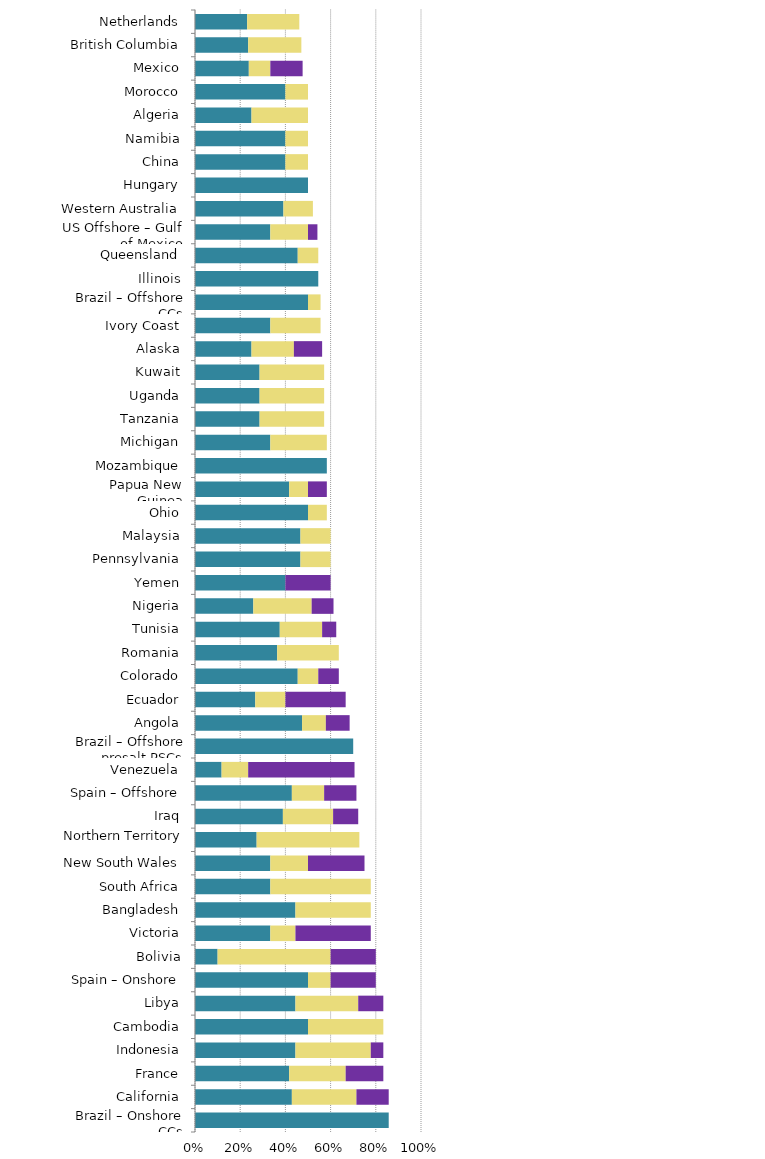
| Category | Mild deterrent to investment | Strong deterrent to investment | Would not pursue investment due to this factor |
|---|---|---|---|
| Brazil – Onshore CCs | 0.857 | 0 | 0 |
| California | 0.429 | 0.286 | 0.143 |
| France | 0.417 | 0.25 | 0.167 |
| Indonesia | 0.444 | 0.333 | 0.056 |
| Cambodia | 0.5 | 0.333 | 0 |
| Libya | 0.444 | 0.278 | 0.111 |
| Spain – Onshore | 0.5 | 0.1 | 0.2 |
| Bolivia | 0.1 | 0.5 | 0.2 |
| Victoria | 0.333 | 0.111 | 0.333 |
| Bangladesh | 0.444 | 0.333 | 0 |
| South Africa | 0.333 | 0.444 | 0 |
| New South Wales | 0.333 | 0.167 | 0.25 |
| Northern Territory | 0.273 | 0.455 | 0 |
| Iraq | 0.389 | 0.222 | 0.111 |
| Spain – Offshore | 0.429 | 0.143 | 0.143 |
| Venezuela | 0.118 | 0.118 | 0.471 |
| Brazil – Offshore presalt PSCs | 0.7 | 0 | 0 |
| Angola | 0.474 | 0.105 | 0.105 |
| Ecuador | 0.267 | 0.133 | 0.267 |
| Colorado | 0.455 | 0.091 | 0.091 |
| Romania | 0.364 | 0.273 | 0 |
| Tunisia | 0.375 | 0.188 | 0.062 |
| Nigeria | 0.258 | 0.258 | 0.097 |
| Yemen | 0.4 | 0 | 0.2 |
| Pennsylvania | 0.467 | 0.133 | 0 |
| Malaysia | 0.467 | 0.133 | 0 |
| Ohio | 0.5 | 0.083 | 0 |
| Papua New Guinea | 0.417 | 0.083 | 0.083 |
| Mozambique | 0.583 | 0 | 0 |
| Michigan | 0.333 | 0.25 | 0 |
| Tanzania | 0.286 | 0.286 | 0 |
| Uganda | 0.286 | 0.286 | 0 |
| Kuwait | 0.286 | 0.286 | 0 |
| Alaska | 0.25 | 0.188 | 0.125 |
| Ivory Coast | 0.333 | 0.222 | 0 |
| Brazil – Offshore CCs | 0.5 | 0.056 | 0 |
| Illinois | 0.545 | 0 | 0 |
| Queensland | 0.455 | 0.091 | 0 |
| US Offshore – Gulf of Mexico | 0.333 | 0.167 | 0.042 |
| Western Australia | 0.391 | 0.13 | 0 |
| Hungary | 0.5 | 0 | 0 |
| China | 0.4 | 0.1 | 0 |
| Namibia | 0.4 | 0.1 | 0 |
| Algeria | 0.25 | 0.25 | 0 |
| Morocco | 0.4 | 0.1 | 0 |
| Mexico | 0.238 | 0.095 | 0.143 |
| British Columbia | 0.235 | 0.235 | 0 |
| Netherlands | 0.231 | 0.231 | 0 |